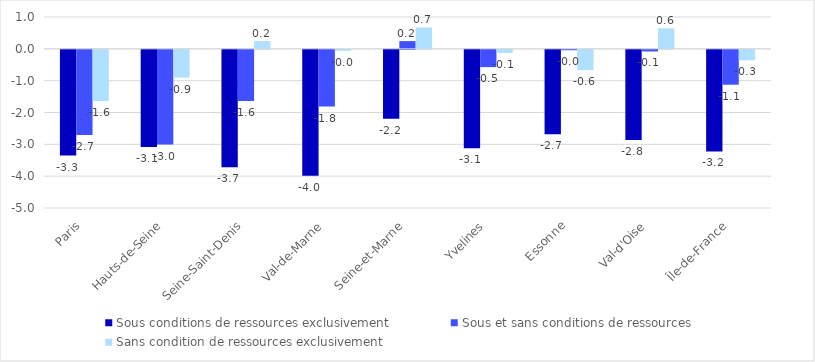
| Category | Sous conditions de ressources exclusivement  | Sous et sans conditions de ressources | Sans condition de ressources exclusivement |
|---|---|---|---|
| Paris | -3.321 | -2.672 | -1.61 |
| Hauts-de-Seine | -3.051 | -2.977 | -0.874 |
| Seine-Saint-Denis | -3.688 | -1.61 | 0.244 |
| Val-de-Marne | -3.956 | -1.783 | -0.033 |
| Seine-et-Marne | -2.163 | 0.243 | 0.674 |
| Yvelines | -3.091 | -0.543 | -0.096 |
| Essonne | -2.651 | -0.013 | -0.637 |
| Val-d'Oise | -2.83 | -0.051 | 0.645 |
| Île-de-France | -3.192 | -1.096 | -0.33 |